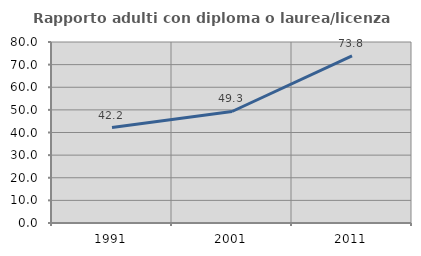
| Category | Rapporto adulti con diploma o laurea/licenza media  |
|---|---|
| 1991.0 | 42.207 |
| 2001.0 | 49.288 |
| 2011.0 | 73.83 |